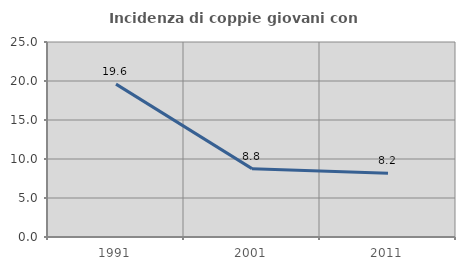
| Category | Incidenza di coppie giovani con figli |
|---|---|
| 1991.0 | 19.6 |
| 2001.0 | 8.765 |
| 2011.0 | 8.171 |